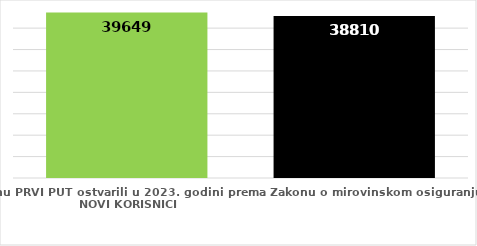
| Category | broj korisnika |
|---|---|
| Korisnici koji su pravo na mirovinu PRVI PUT ostvarili u 2023. godini prema Zakonu o mirovinskom osiguranju - NOVI KORISNICI | 39649 |
| Korisnici mirovina kojima je u 2023. godini PRESTALO PRAVO NA MIROVINU - uzrok smrt 
koji su pravo na mirovinu ostvarili prema Zakonu o mirovinskom osiguranju | 38810 |